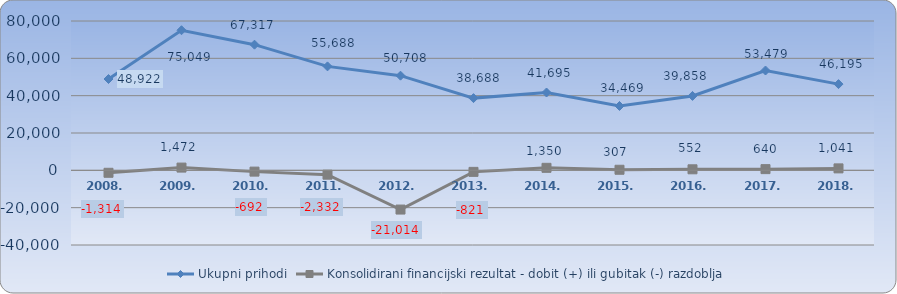
| Category | Ukupni prihodi | Konsolidirani financijski rezultat - dobit (+) ili gubitak (-) razdoblja |
|---|---|---|
| 2008.  | 48921.602 | -1314.349 |
| 2009.  | 75048.781 | 1472.104 |
| 2010.  | 67316.979 | -691.654 |
| 2011.  | 55687.836 | -2331.861 |
| 2012.  | 50707.894 | -21013.769 |
| 2013.  | 38688.379 | -821.172 |
| 2014.  | 41695.27 | 1349.563 |
| 2015.  | 34469.184 | 306.695 |
| 2016.  | 39857.897 | 551.689 |
| 2017. | 53479.04 | 639.995 |
| 2018. | 46194.797 | 1040.924 |